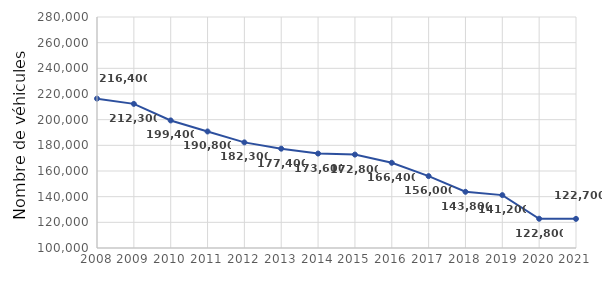
| Category | Series 0 |
|---|---|
| 2008.0 | 216400 |
| 2009.0 | 212300 |
| 2010.0 | 199400 |
| 2011.0 | 190800 |
| 2012.0 | 182300 |
| 2013.0 | 177400 |
| 2014.0 | 173600 |
| 2015.0 | 172800 |
| 2016.0 | 166400 |
| 2017.0 | 156000 |
| 2018.0 | 143800 |
| 2019.0 | 141200 |
| 2020.0 | 122800 |
| 2021.0 | 122700 |